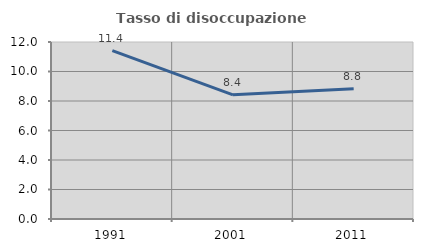
| Category | Tasso di disoccupazione giovanile  |
|---|---|
| 1991.0 | 11.409 |
| 2001.0 | 8.421 |
| 2011.0 | 8.824 |